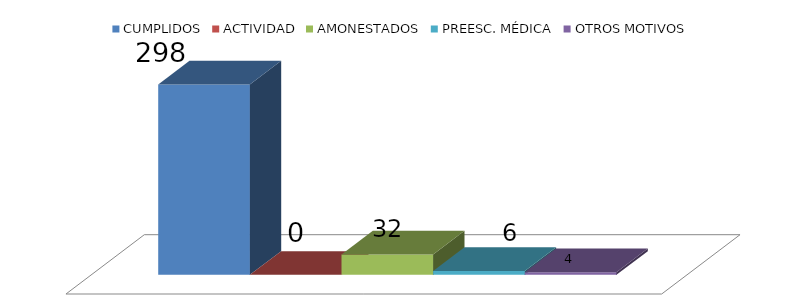
| Category | CUMPLIDOS | ACTIVIDAD | AMONESTADOS | PREESC. MÉDICA | OTROS MOTIVOS |
|---|---|---|---|---|---|
| 0 | 298 | 0 | 32 | 6 | 4 |